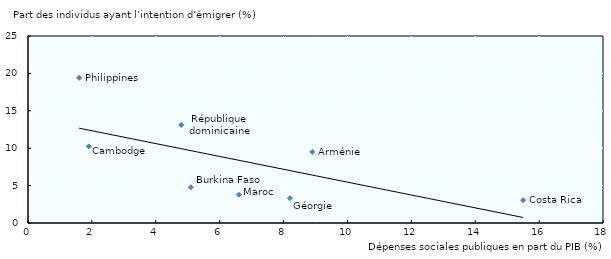
| Category | Part des individus ayant l’intention d’émigre |
|---|---|
| 8.9 | 9.5 |
| 5.1 | 4.79 |
| 1.9 | 10.24 |
| 15.5 | 3.05 |
| 4.8 | 13.12 |
| 8.2 | 3.33 |
| 6.6 | 3.79 |
| 1.6 | 19.41 |